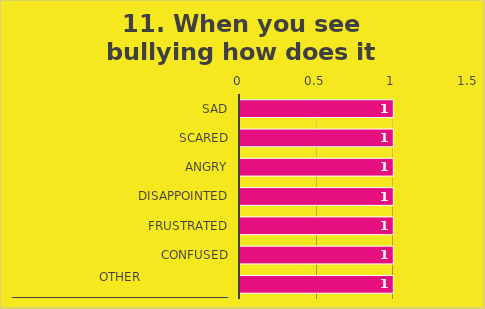
| Category | Field1 |
|---|---|
| Sad | 1 |
| Scared | 1 |
| Angry | 1 |
| Disappointed | 1 |
| Frustrated | 1 |
| Confused | 1 |
| Other ____________________________________ | 1 |